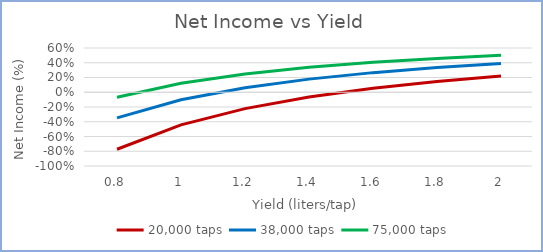
| Category | 20,000 taps | 38,000 taps | 75,000 taps |
|---|---|---|---|
| 0.8 | -0.773 | -0.348 | -0.069 |
| 1.0 | -0.443 | -0.102 | 0.121 |
| 1.2 | -0.222 | 0.061 | 0.247 |
| 1.4 | -0.065 | 0.178 | 0.338 |
| 1.6 | 0.053 | 0.266 | 0.406 |
| 1.8 | 0.145 | 0.334 | 0.458 |
| 2.0 | 0.219 | 0.389 | 0.501 |